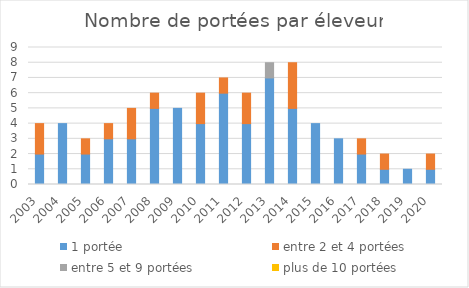
| Category | 1 portée | entre 2 et 4 portées | entre 5 et 9 portées | plus de 10 portées |
|---|---|---|---|---|
| 2003.0 | 2 | 2 | 0 | 0 |
| 2004.0 | 4 | 0 | 0 | 0 |
| 2005.0 | 2 | 1 | 0 | 0 |
| 2006.0 | 3 | 1 | 0 | 0 |
| 2007.0 | 3 | 2 | 0 | 0 |
| 2008.0 | 5 | 1 | 0 | 0 |
| 2009.0 | 5 | 0 | 0 | 0 |
| 2010.0 | 4 | 2 | 0 | 0 |
| 2011.0 | 6 | 1 | 0 | 0 |
| 2012.0 | 4 | 2 | 0 | 0 |
| 2013.0 | 7 | 0 | 1 | 0 |
| 2014.0 | 5 | 3 | 0 | 0 |
| 2015.0 | 4 | 0 | 0 | 0 |
| 2016.0 | 3 | 0 | 0 | 0 |
| 2017.0 | 2 | 1 | 0 | 0 |
| 2018.0 | 1 | 1 | 0 | 0 |
| 2019.0 | 1 | 0 | 0 | 0 |
| 2020.0 | 1 | 1 | 0 | 0 |